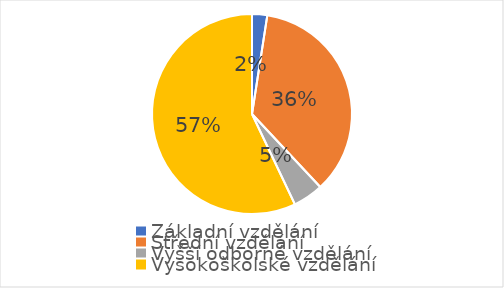
| Category | Series 0 |
|---|---|
| Základní vzdělání | 4 |
| Střední vzdělání | 58 |
| Vyšší odborné vzdělání | 8 |
| Vysokoškolské vzdělání | 93 |